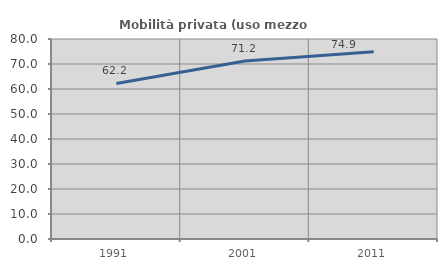
| Category | Mobilità privata (uso mezzo privato) |
|---|---|
| 1991.0 | 62.215 |
| 2001.0 | 71.238 |
| 2011.0 | 74.93 |